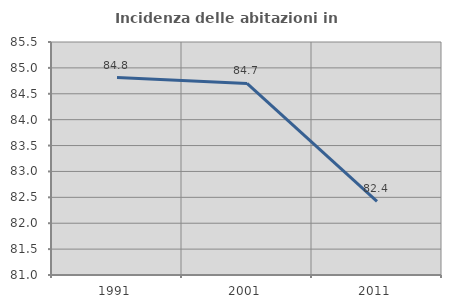
| Category | Incidenza delle abitazioni in proprietà  |
|---|---|
| 1991.0 | 84.814 |
| 2001.0 | 84.699 |
| 2011.0 | 82.423 |